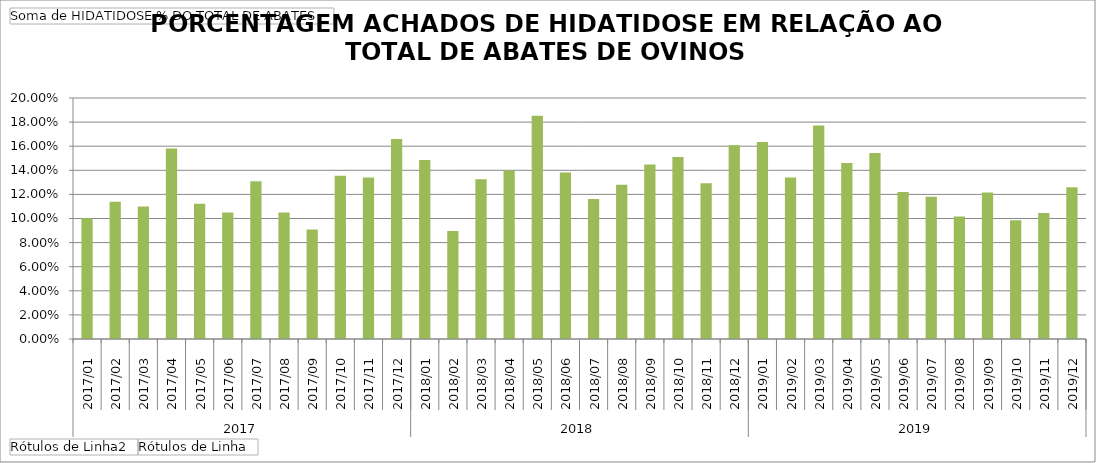
| Category | Total |
|---|---|
| 0 | 0.1 |
| 1 | 0.114 |
| 2 | 0.11 |
| 3 | 0.158 |
| 4 | 0.112 |
| 5 | 0.105 |
| 6 | 0.131 |
| 7 | 0.105 |
| 8 | 0.091 |
| 9 | 0.136 |
| 10 | 0.134 |
| 11 | 0.166 |
| 12 | 0.148 |
| 13 | 0.09 |
| 14 | 0.133 |
| 15 | 0.14 |
| 16 | 0.185 |
| 17 | 0.138 |
| 18 | 0.116 |
| 19 | 0.128 |
| 20 | 0.145 |
| 21 | 0.151 |
| 22 | 0.129 |
| 23 | 0.161 |
| 24 | 0.163 |
| 25 | 0.134 |
| 26 | 0.177 |
| 27 | 0.146 |
| 28 | 0.154 |
| 29 | 0.122 |
| 30 | 0.118 |
| 31 | 0.102 |
| 32 | 0.122 |
| 33 | 0.099 |
| 34 | 0.105 |
| 35 | 0.126 |